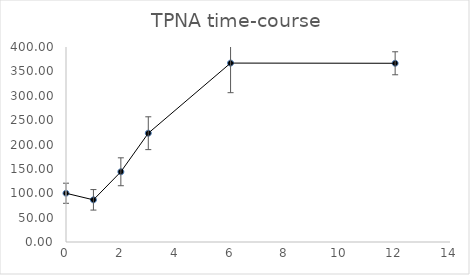
| Category | Series 0 |
|---|---|
| 0.0 | 100 |
| 1.0 | 86.506 |
| 2.0 | 144.055 |
| 3.0 | 223.167 |
| 6.0 | 366.991 |
| 12.0 | 366.608 |